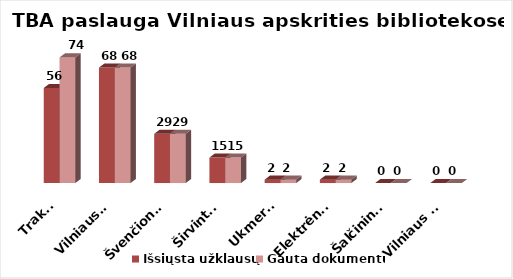
| Category | Išsiųsta užklausų | Gauta dokumentų |
|---|---|---|
| Trakai | 56 | 74 |
| Vilniaus r. | 68 | 68 |
| Švenčionys | 29 | 29 |
| Širvintos | 15 | 15 |
| Ukmergė | 2 | 2 |
| Elektrėnai | 2 | 2 |
| Šalčininkai | 0 | 0 |
| Vilniaus m. | 0 | 0 |